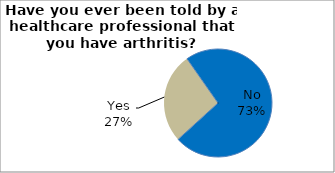
| Category | Series 0 |
|---|---|
| No | 72.954 |
| Yes | 27.046 |